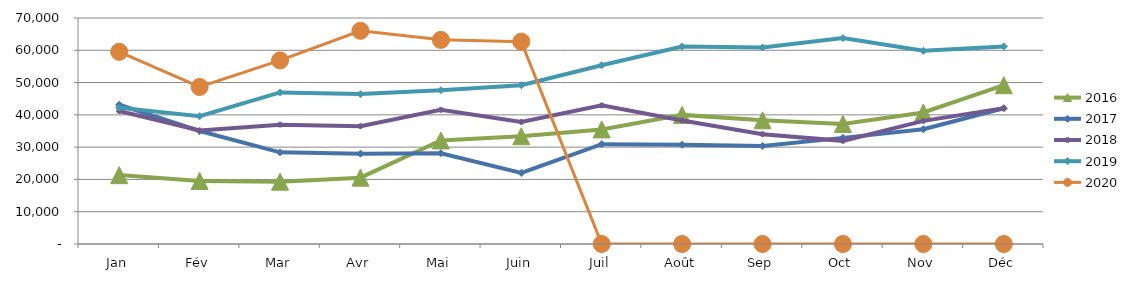
| Category | 2015 | 2016 | 2017 | 2018 | 2019 | 2020 |
|---|---|---|---|---|---|---|
| Jan |  | 21335.134 | 43138.429 | 41189.736 | 42238.432 | 59529.375 |
| Fév |  | 19532.337 | 35009.004 | 35137.047 | 39568.195 | 48642.784 |
| Mar |  | 19313.57 | 28389.673 | 36966.816 | 46942.202 | 56859.842 |
| Avr |  | 20550.618 | 27972.802 | 36485.223 | 46427.766 | 66040.178 |
| Mai |  | 32066.609 | 28116.194 | 41558.724 | 47634.031 | 63227.558 |
| Juin |  | 33383.309 | 22002.869 | 37797.134 | 49186.221 | 62659.884 |
| Juil |  | 35495.63 | 30926.131 | 42927.847 | 55367.883 | 0 |
| Août |  | 39992.765 | 30717.708 | 38263.165 | 61146.365 | 0 |
| Sep |  | 38306.611 | 30378.863 | 34011.672 | 60874.85 | 0 |
| Oct |  | 37188.976 | 32868.78 | 31946.792 | 63789.634 | 0 |
| Nov |  | 40729.636 | 35537.079 | 38139.513 | 59829.208 | 0 |
| Déc |  | 49180.232 | 42040.249 | 42064.579 | 61190.831 | 0 |